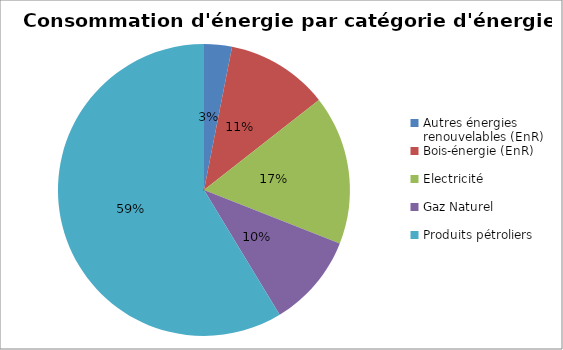
| Category | Series 0 |
|---|---|
| Autres énergies renouvelables (EnR) | 18253.391 |
| Bois-énergie (EnR) | 67090.492 |
| Electricité | 98080.165 |
| Gaz Naturel | 61236.178 |
| Produits pétroliers | 347305.357 |